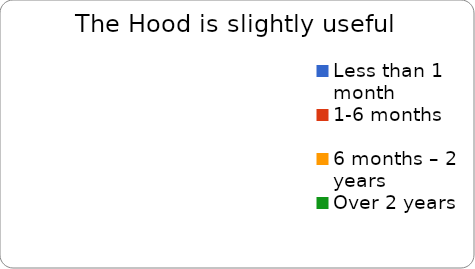
| Category | Slightly useful |
|---|---|
| Less than 1 month | 0 |
| 1-6 months | 0 |
| 6 months – 2 years | 0 |
| Over 2 years | 0 |